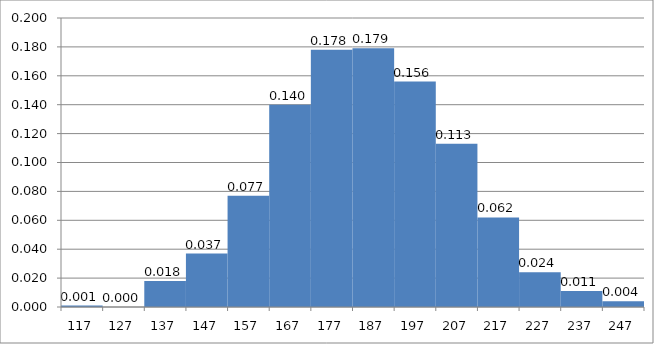
| Category | Rel Freq Histogram of Chips  |
|---|---|
| 117.0 | 0.001 |
| 127.0 | 0 |
| 137.0 | 0.018 |
| 147.0 | 0.037 |
| 157.0 | 0.077 |
| 167.0 | 0.14 |
| 177.0 | 0.178 |
| 187.0 | 0.179 |
| 197.0 | 0.156 |
| 207.0 | 0.113 |
| 217.0 | 0.062 |
| 227.0 | 0.024 |
| 237.0 | 0.011 |
| 247.0 | 0.004 |